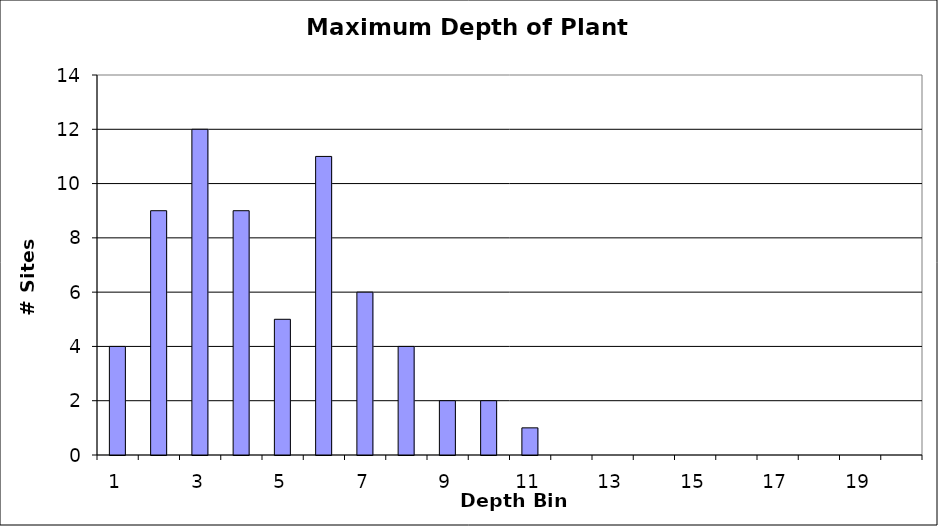
| Category | Series 0 |
|---|---|
| 1.0 | 4 |
| 2.0 | 9 |
| 3.0 | 12 |
| 4.0 | 9 |
| 5.0 | 5 |
| 6.0 | 11 |
| 7.0 | 6 |
| 8.0 | 4 |
| 9.0 | 2 |
| 10.0 | 2 |
| 11.0 | 1 |
| 12.0 | 0 |
| 13.0 | 0 |
| 14.0 | 0 |
| 15.0 | 0 |
| 16.0 | 0 |
| 17.0 | 0 |
| 18.0 | 0 |
| 19.0 | 0 |
| 20.0 | 0 |